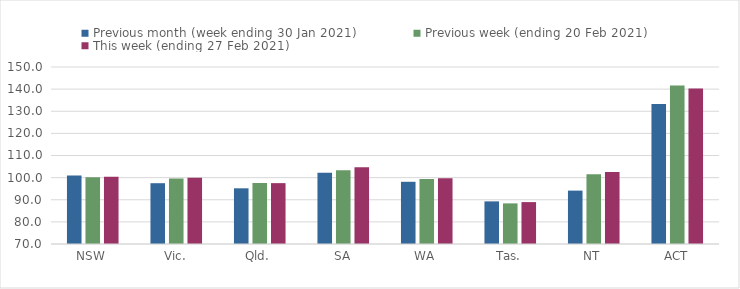
| Category | Previous month (week ending 30 Jan 2021) | Previous week (ending 20 Feb 2021) | This week (ending 27 Feb 2021) |
|---|---|---|---|
| NSW | 100.96 | 100.17 | 100.35 |
| Vic. | 97.48 | 99.65 | 99.94 |
| Qld. | 95.17 | 97.58 | 97.51 |
| SA | 102.2 | 103.32 | 104.7 |
| WA | 98.12 | 99.38 | 99.74 |
| Tas. | 89.26 | 88.36 | 88.94 |
| NT | 94.13 | 101.52 | 102.54 |
| ACT | 133.33 | 141.67 | 140.28 |